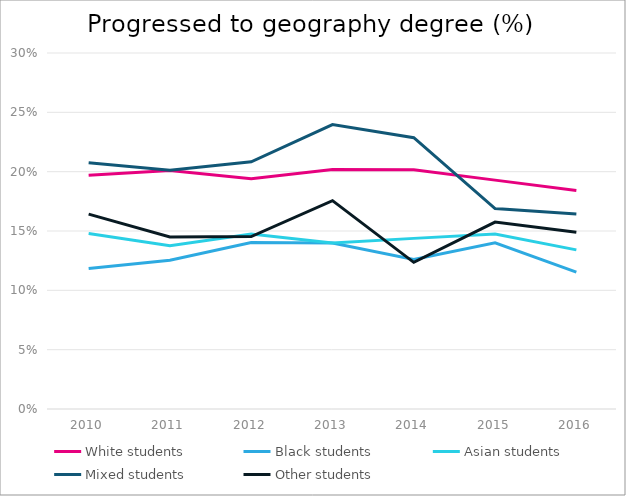
| Category | White students | Black students | Asian students | Mixed students | Other students |
|---|---|---|---|---|---|
| 2010.0 | 0.197 | 0.118 | 0.148 | 0.208 | 0.164 |
| 2011.0 | 0.201 | 0.125 | 0.137 | 0.201 | 0.145 |
| 2012.0 | 0.194 | 0.14 | 0.147 | 0.208 | 0.145 |
| 2013.0 | 0.202 | 0.14 | 0.14 | 0.24 | 0.176 |
| 2014.0 | 0.202 | 0.126 | 0.144 | 0.229 | 0.124 |
| 2015.0 | 0.193 | 0.14 | 0.147 | 0.169 | 0.157 |
| 2016.0 | 0.184 | 0.115 | 0.134 | 0.164 | 0.149 |